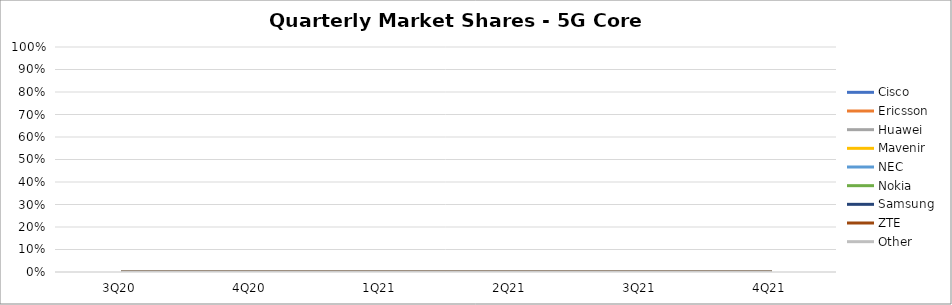
| Category | Cisco | Ericsson | Huawei | Mavenir | NEC | Nokia | Samsung | ZTE | Other |
|---|---|---|---|---|---|---|---|---|---|
| 3Q20 | 0 | 0 | 0 | 0 | 0 | 0 | 0 | 0 | 0 |
| 4Q20 | 0 | 0 | 0 | 0 | 0 | 0 | 0 | 0 | 0 |
| 1Q21 | 0 | 0 | 0 | 0 | 0 | 0 | 0 | 0 | 0 |
| 2Q21 | 0 | 0 | 0 | 0 | 0 | 0 | 0 | 0 | 0 |
| 3Q21 | 0 | 0 | 0 | 0 | 0 | 0 | 0 | 0 | 0 |
| 4Q21 | 0 | 0 | 0 | 0 | 0 | 0 | 0 | 0 | 0 |